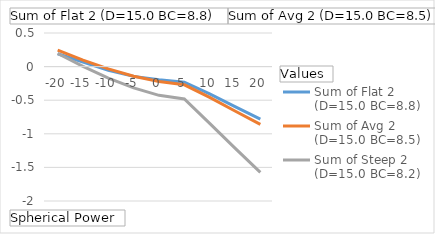
| Category | Sum of Flat 2 (D=15.0 BC=8.8) | Sum of Avg 2 (D=15.0 BC=8.5) | Sum of Steep 2 (D=15.0 BC=8.2) |
|---|---|---|---|
| -20 | 0.191 | 0.245 | 0.195 |
| -15 | 0.068 | 0.097 | 0.004 |
| -10 | -0.054 | -0.035 | -0.171 |
| -5 | -0.146 | -0.143 | -0.318 |
| 0 | -0.196 | -0.221 | -0.428 |
| 5 | -0.232 | -0.271 | -0.481 |
| 10 | -0.406 | -0.457 | -0.846 |
| 15 | -0.595 | -0.661 | -1.214 |
| 20 | -0.782 | -0.86 | -1.575 |